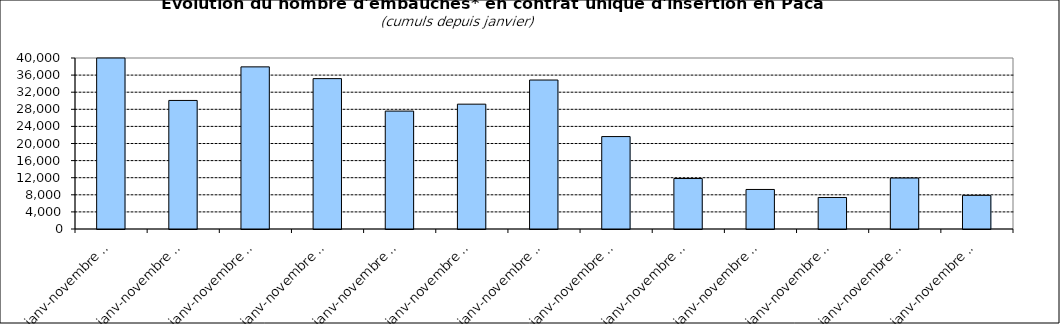
| Category | Series 1 |
|---|---|
| janv-novembre 2010  | 42122 |
| janv-novembre 2011  | 30073 |
| janv-novembre 2012  | 37927 |
| janv-novembre 2013  | 35176 |
| janv-novembre 2014  | 27581 |
| janv-novembre 2015  | 29201 |
| janv-novembre 2016  | 34847 |
| janv-novembre 2017  | 21621 |
| janv-novembre 2018  | 11806 |
| janv-novembre 2019  | 9249 |
| janv-novembre 2020  | 7375 |
| janv-novembre 2021  | 11926 |
| janv-novembre 2022  | 7870 |